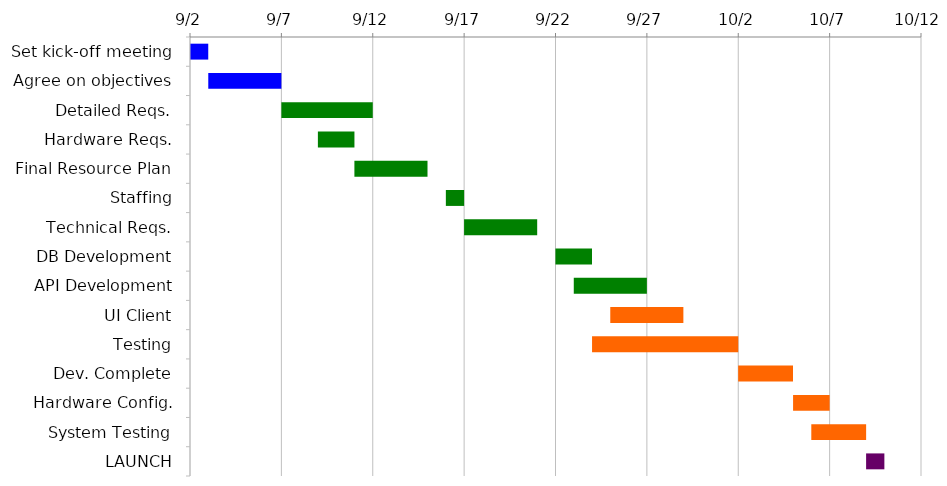
| Category | START | DAYS |
|---|---|---|
| Set kick-off meeting | 2022-09-02 | 1 |
| Agree on objectives | 2022-09-03 | 4 |
| Detailed Reqs. | 2022-09-07 | 5 |
| Hardware Reqs. | 2022-09-09 | 2 |
| Final Resource Plan | 2022-09-11 | 4 |
| Staffing | 2022-09-16 | 1 |
| Technical Reqs. | 2022-09-17 | 4 |
| DB Development | 2022-09-22 | 2 |
| API Development | 2022-09-23 | 4 |
| UI Client | 2022-09-25 | 4 |
| Testing | 2022-09-24 | 8 |
| Dev. Complete | 2022-10-02 | 3 |
| Hardware Config. | 2022-10-05 | 2 |
| System Testing | 2022-10-06 | 3 |
| LAUNCH | 2022-10-09 | 1 |